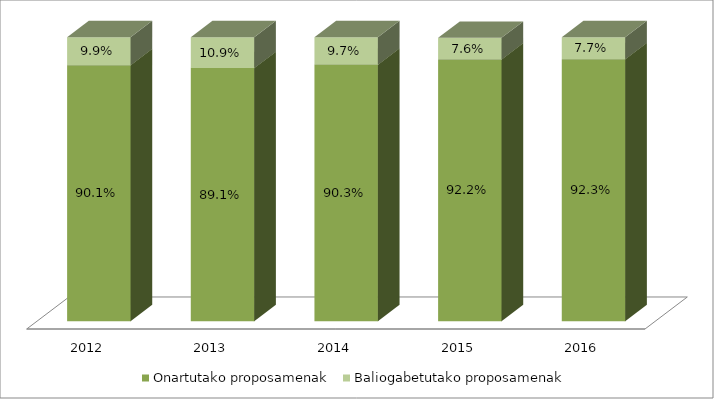
| Category | Onartutako proposamenak | Baliogabetutako proposamenak |
|---|---|---|
| 2012.0 | 0.901 | 0.099 |
| 2013.0 | 0.891 | 0.109 |
| 2014.0 | 0.903 | 0.097 |
| 2015.0 | 0.922 | 0.076 |
| 2016.0 | 0.923 | 0.077 |